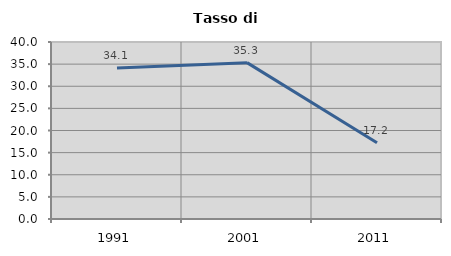
| Category | Tasso di disoccupazione   |
|---|---|
| 1991.0 | 34.112 |
| 2001.0 | 35.337 |
| 2011.0 | 17.241 |